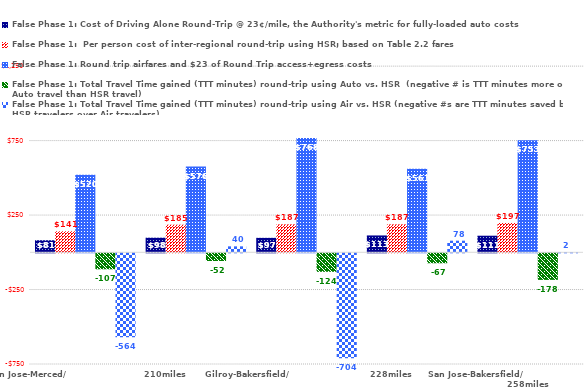
| Category | False Phase 1: Cost of Driving Alone Round-Trip @ 23¢/mile, the Authority's metric for fully-loaded auto costs | False Phase 1:  Per person cost of inter-regional round-trip using HSR; based on Table 2.2 fares | False Phase 1: Round trip airfares and $23 of Round Trip access+egress costs | False Phase 1: Total Travel Time gained (TTT minutes) round-trip using Auto vs. HSR  (negative # is TTT minutes more of Auto travel than HSR travel) | False Phase 1: Total Travel Time gained (TTT minutes) round-trip using Air vs. HSR (negative #s are TTT minutes saved by HSR travelers over Air travelers) |
|---|---|---|---|---|---|
| San Jose-Merced/                          210miles | 80.96 | 141 | 520 | -107.2 | -564 |
| Millbrae-KT Hanford/                 217miles | 97.98 | 185 | 576 | -51.9 | 40 |
| Gilroy-Bakersfield/                           228miles | 97.06 | 187 | 768 | -124.2 | -704 |
| San Francisco-KT Hanford/                              243miles | 113.16 | 187 | 561 | -66.8 | 78 |
| San Jose-Bakersfield/                                      258miles | 111.32 | 197 | 753 | -178.4 | 2 |